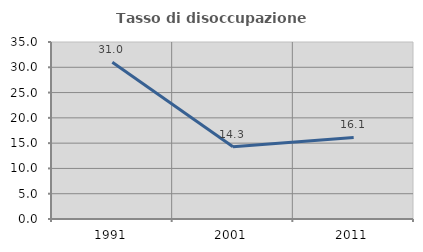
| Category | Tasso di disoccupazione giovanile  |
|---|---|
| 1991.0 | 30.986 |
| 2001.0 | 14.286 |
| 2011.0 | 16.129 |